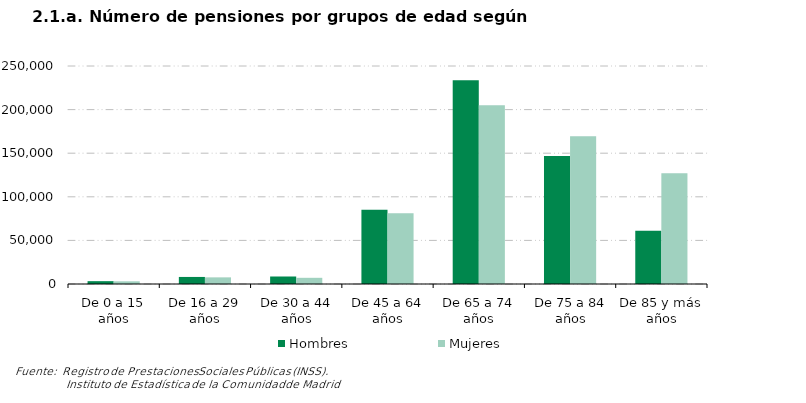
| Category | Hombres | Mujeres |
|---|---|---|
| De 0 a 15 años | 3254 | 3094 |
| De 16 a 29 años | 8089 | 7611 |
| De 30 a 44 años | 8599 | 7098 |
| De 45 a 64 años | 85221 | 81102 |
| De 65 a 74 años | 233713 | 204940 |
| De 75 a 84 años | 146879 | 169414 |
| De 85 y más años | 61062 | 126866 |